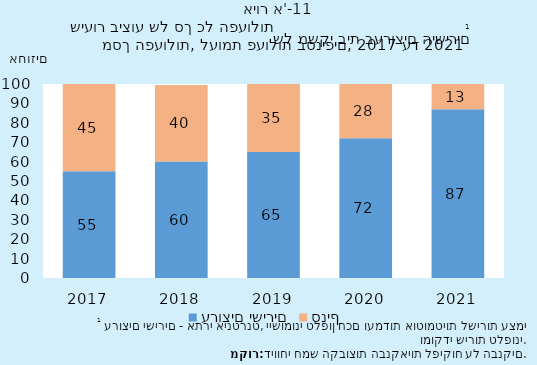
| Category | ערוצים ישירים | סניף |
|---|---|---|
| 2017.0 | 55 | 45 |
| 2018.0 | 60 | 39.533 |
| 2019.0 | 65 | 35 |
| 2020.0 | 72 | 28 |
| 2021.0 | 87 | 13 |